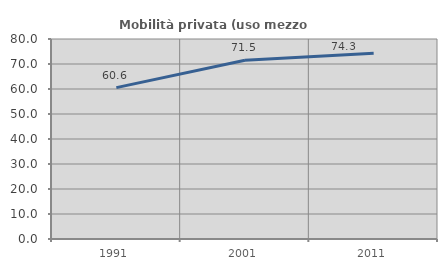
| Category | Mobilità privata (uso mezzo privato) |
|---|---|
| 1991.0 | 60.553 |
| 2001.0 | 71.516 |
| 2011.0 | 74.268 |